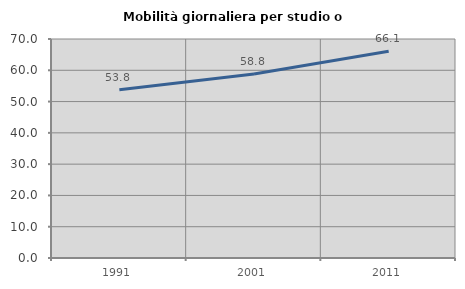
| Category | Mobilità giornaliera per studio o lavoro |
|---|---|
| 1991.0 | 53.79 |
| 2001.0 | 58.787 |
| 2011.0 | 66.065 |